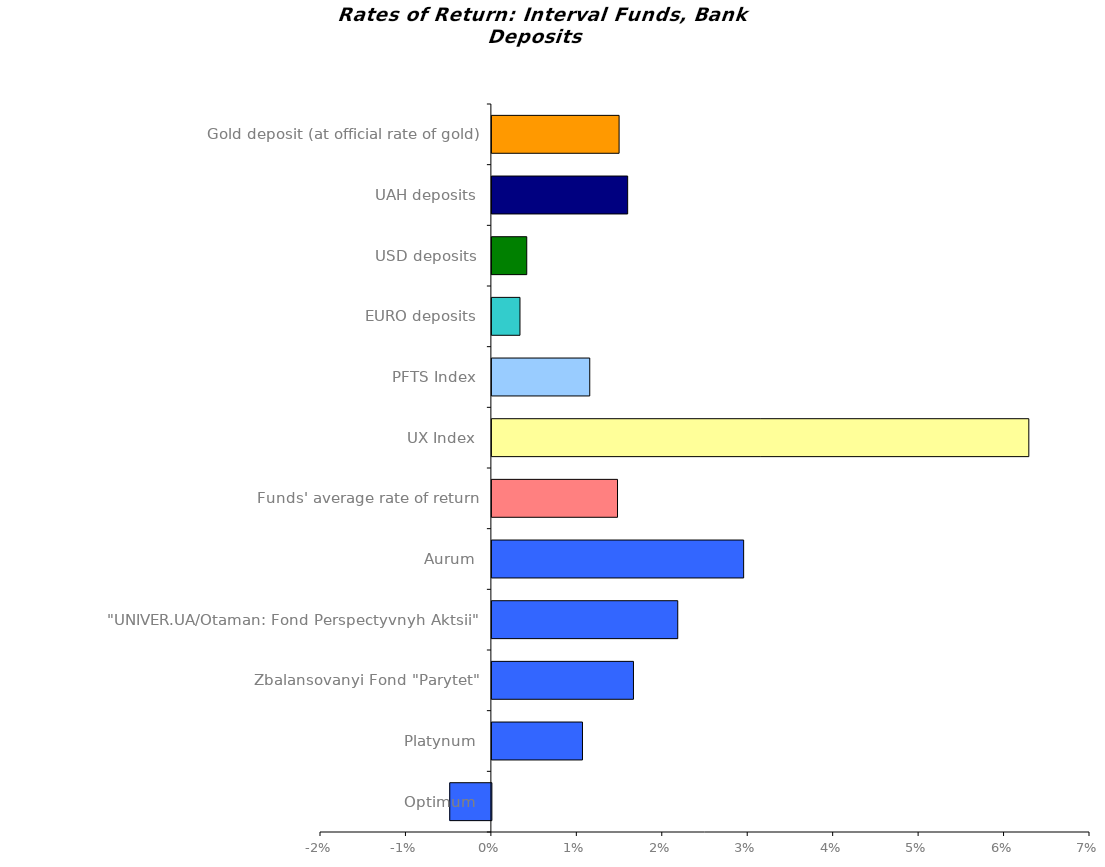
| Category | Series 0 |
|---|---|
| Optimum | -0.005 |
| Platynum | 0.011 |
| Zbalansovanyi Fond "Parytet" | 0.017 |
| "UNIVER.UA/Otaman: Fond Perspectyvnyh Aktsii"  | 0.022 |
| Аurum | 0.029 |
| Funds' average rate of return | 0.015 |
| UX Index | 0.063 |
| PFTS Index | 0.011 |
| EURO deposits | 0.003 |
| USD deposits | 0.004 |
| UAH deposits | 0.016 |
| Gold deposit (at official rate of gold) | 0.015 |